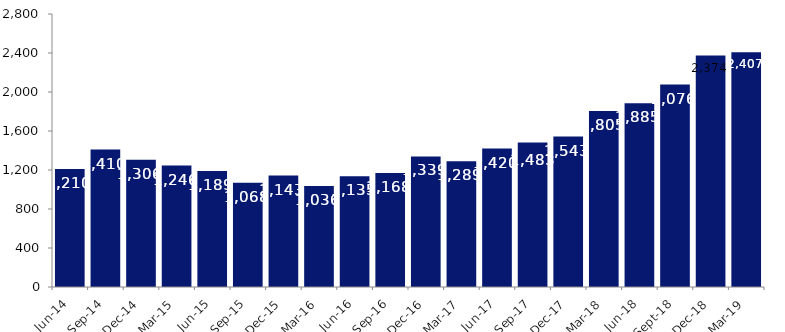
| Category | Series 0 |
|---|---|
| Jun-14 | 1210 |
| Sep-14 | 1410 |
| Dec-14 | 1306 |
| Mar-15 | 1246 |
| Jun-15 | 1189 |
| Sep-15 | 1068 |
| Dec-15 | 1143 |
| Mar-16 | 1036 |
| Jun-16 | 1135 |
| Sep-16 | 1168 |
| Dec-16 | 1339 |
| Mar-17 | 1289 |
| Jun-17 | 1420 |
| Sep-17 | 1483 |
| Dec-17 | 1543 |
| Mar-18 | 1805 |
| Jun-18 | 1885 |
| Sep-18 | 2076 |
| Dec-18 | 2374 |
| Mar-19 | 2407 |